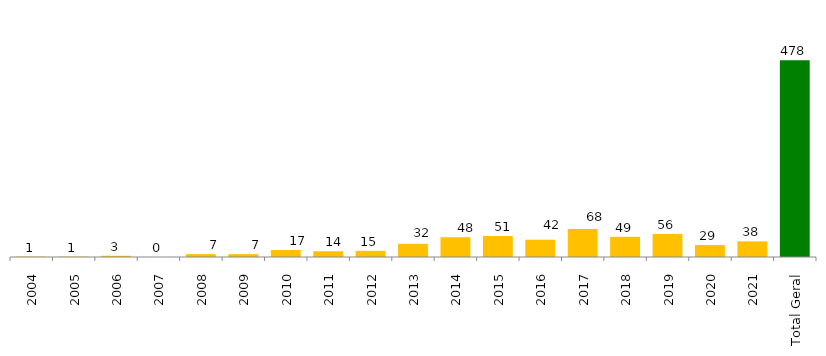
| Category | Categoria/Ano |
|---|---|
| 2004 | 1 |
| 2005 | 1 |
| 2006 | 3 |
| 2007 | 0 |
| 2008 | 7 |
| 2009 | 7 |
| 2010 | 17 |
| 2011 | 14 |
| 2012 | 15 |
| 2013 | 32 |
| 2014 | 48 |
| 2015 | 51 |
| 2016 | 42 |
| 2017 | 68 |
| 2018 | 49 |
| 2019 | 56 |
| 2020 | 29 |
| 2021 | 38 |
| Total Geral | 478 |